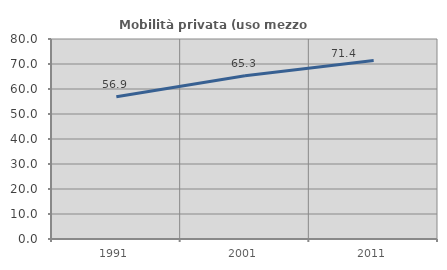
| Category | Mobilità privata (uso mezzo privato) |
|---|---|
| 1991.0 | 56.906 |
| 2001.0 | 65.327 |
| 2011.0 | 71.366 |